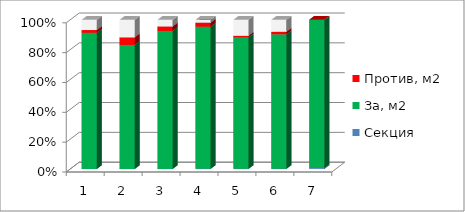
| Category | Секция | За, м2 | Против, м2 | Возд., м2 |
|---|---|---|---|---|
| 0 | 1 | 3215.512 | 64.6 | 239.9 |
| 1 | 2 | 2842.58 | 173.9 | 400 |
| 2 | 3 | 3447.694 | 112.275 | 164.7 |
| 3 | 4 | 2959.78 | 83.4 | 58.7 |
| 4 | 5 | 3174.63 | 37.6 | 386.77 |
| 5 | 6 | 2134.15 | 39.4 | 189.8 |
| 6 | 7 | 1110.4 | 0 | 0 |